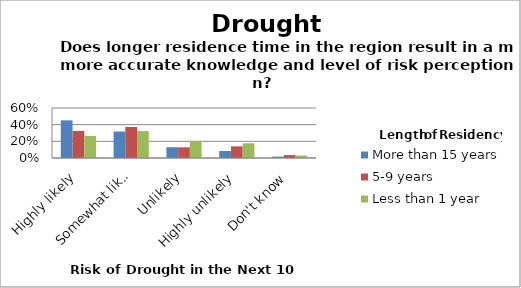
| Category | More than 15 years | 5-9 years | Less than 1 year |
|---|---|---|---|
| Highly likely | 0.452 | 0.326 | 0.265 |
| Somewhat likely | 0.318 | 0.372 | 0.324 |
| Unlikely | 0.13 | 0.128 | 0.206 |
| Highly unlikely | 0.084 | 0.14 | 0.176 |
| Don't know | 0.017 | 0.035 | 0.029 |